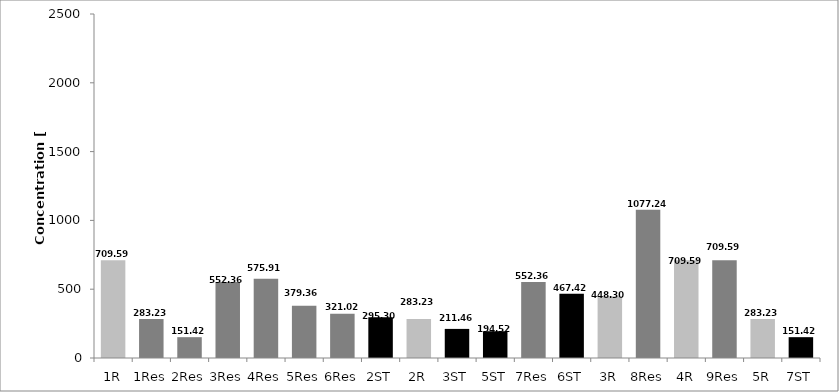
| Category | Concentrations of triclosan |
|---|---|
| 1R | 709.591 |
| 1Res | 283.228 |
| 2Res | 151.419 |
| 3Res | 552.364 |
| 4Res | 575.911 |
| 5Res | 379.359 |
| 6Res | 321.017 |
| 2ST | 295.303 |
| 2R | 283.228 |
| 3ST | 211.458 |
| 5ST | 194.519 |
| 7Res | 552.364 |
| 6ST | 467.415 |
| 3R | 448.304 |
| 8Res | 1077.242 |
| 4R | 709.591 |
| 9Res | 709.591 |
| 5R | 283.228 |
| 7ST | 151.419 |